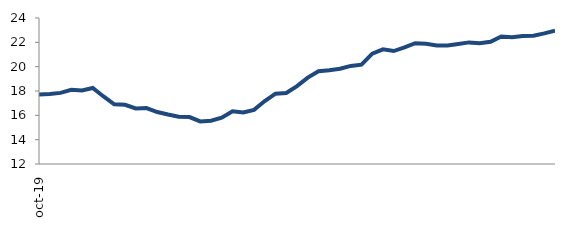
| Category | Series 0 |
|---|---|
| 2019-10-01 | 17.704 |
| 2019-11-01 | 17.747 |
| 2019-12-01 | 17.844 |
| 2020-01-01 | 18.099 |
| 2020-02-01 | 18.039 |
| 2020-03-01 | 18.244 |
| 2020-04-01 | 17.551 |
| 2020-05-01 | 16.911 |
| 2020-06-01 | 16.867 |
| 2020-07-01 | 16.563 |
| 2020-08-01 | 16.602 |
| 2020-09-01 | 16.272 |
| 2020-10-01 | 16.069 |
| 2020-11-01 | 15.889 |
| 2020-12-01 | 15.855 |
| 2021-01-01 | 15.501 |
| 2021-02-01 | 15.555 |
| 2021-03-01 | 15.803 |
| 2021-04-01 | 16.335 |
| 2021-05-01 | 16.232 |
| 2021-06-01 | 16.452 |
| 2021-07-01 | 17.177 |
| 2021-08-01 | 17.778 |
| 2021-09-01 | 17.842 |
| 2021-10-01 | 18.396 |
| 2021-11-01 | 19.101 |
| 2021-12-01 | 19.622 |
| 2022-01-01 | 19.702 |
| 2022-02-01 | 19.825 |
| 2022-03-01 | 20.061 |
| 2022-04-01 | 20.163 |
| 2022-05-01 | 21.067 |
| 2022-06-01 | 21.42 |
| 2022-07-01 | 21.282 |
| 2022-08-01 | 21.579 |
| 2022-09-01 | 21.932 |
| 2022-10-01 | 21.875 |
| 2022-11-01 | 21.741 |
| 2022-12-01 | 21.732 |
| 2023-01-01 | 21.858 |
| 2023-02-01 | 21.995 |
| 2023-03-01 | 21.919 |
| 2023-04-01 | 22.045 |
| 2023-05-01 | 22.483 |
| 2023-06-01 | 22.416 |
| 2023-07-01 | 22.523 |
| 2023-08-01 | 22.55 |
| 2023-09-01 | 22.733 |
| 2023-10-01 | 22.948 |